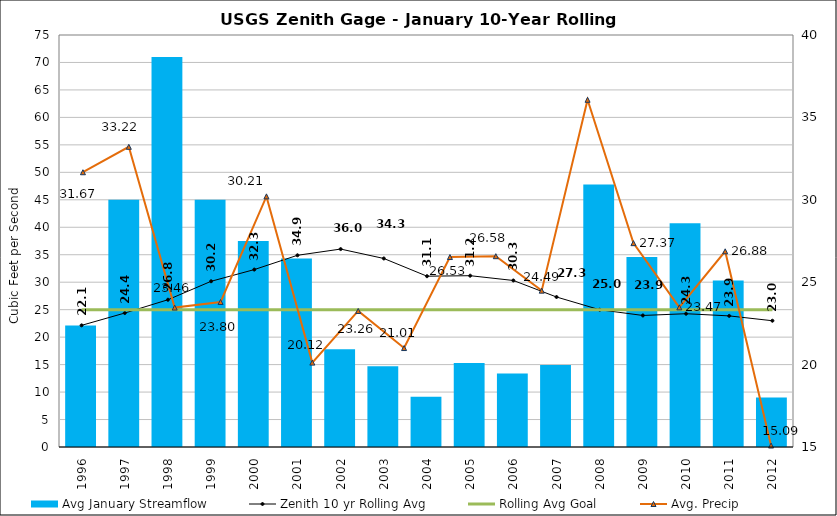
| Category | Avg January Streamflow |
|---|---|
| 1996.0 | 22.1 |
| 1997.0 | 45 |
| 1998.0 | 71 |
| 1999.0 | 45 |
| 2000.0 | 37.5 |
| 2001.0 | 34.3 |
| 2002.0 | 17.8 |
| 2003.0 | 14.7 |
| 2004.0 | 9.13 |
| 2005.0 | 15.3 |
| 2006.0 | 13.4 |
| 2007.0 | 14.91 |
| 2008.0 | 47.8 |
| 2009.0 | 34.6 |
| 2010.0 | 40.71 |
| 2011.0 | 30.3 |
| 2012.0 | 9 |